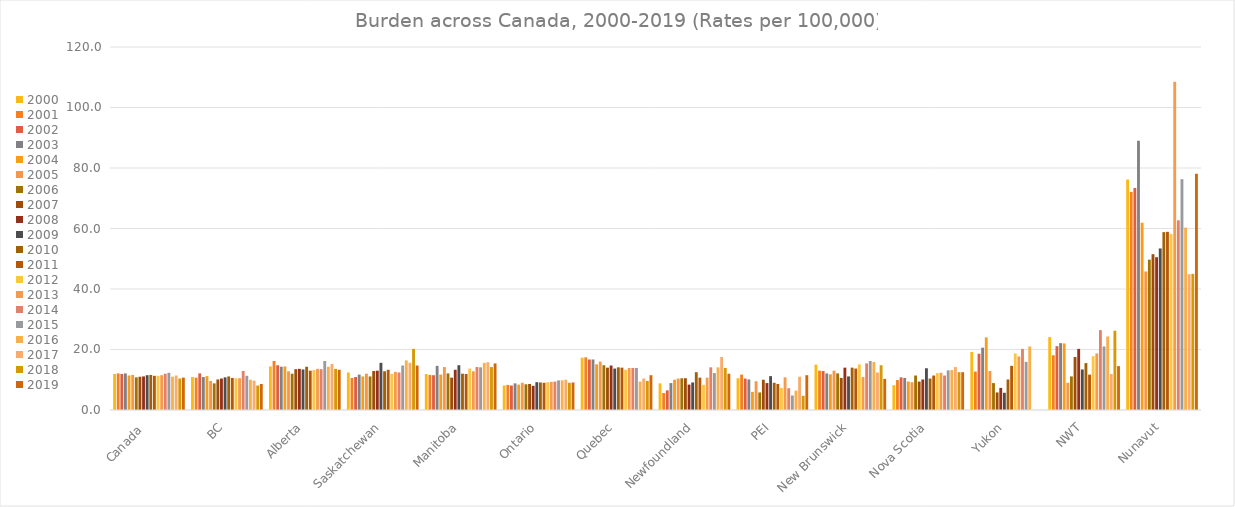
| Category | 2000 | 2001 | 2002 | 2003 | 2004 | 2005 | 2006 | 2007 | 2008 | 2009 | 2010 | 2011 | 2012 | 2013 | 2014 | 2015 | 2016 | 2017 | 2018 | 2019 |
|---|---|---|---|---|---|---|---|---|---|---|---|---|---|---|---|---|---|---|---|---|
| Canada  | 11.9 | 12.1 | 11.9 | 12.1 | 11.4 | 11.6 | 10.8 | 11 | 11.1 | 11.5 | 11.6 | 11.3 | 11.3 | 11.5 | 12 | 12.3 | 11 | 11.4 | 10.4 | 10.7 |
| BC | 10.9 | 10.7 | 12.1 | 10.9 | 11.2 | 9.6 | 8.8 | 10.1 | 10.4 | 10.8 | 11.1 | 10.6 | 10.5 | 10.5 | 12.9 | 11.3 | 10 | 9.7 | 8.1 | 8.6 |
| Alberta | 14.4 | 16.2 | 14.8 | 14.3 | 14.4 | 12.8 | 12 | 13.5 | 13.6 | 13.4 | 14.3 | 13 | 13.2 | 13.6 | 13.5 | 16.2 | 14.3 | 15.2 | 13.6 | 13.3 |
| Saskatchewan | 12.4 | 10.6 | 10.9 | 11.7 | 11.1 | 12 | 11.1 | 12.9 | 13 | 15.6 | 12.8 | 13.3 | 12 | 12.6 | 12.4 | 14.7 | 16.4 | 15.6 | 20.2 | 14.7 |
| Manitoba | 11.9 | 11.6 | 11.5 | 14.6 | 11.7 | 14.2 | 12.1 | 10.7 | 13.3 | 14.8 | 12 | 11.9 | 13.7 | 12.8 | 14.2 | 14.1 | 15.6 | 15.8 | 14.2 | 15.4 |
| Ontario | 8.1 | 8.3 | 8.1 | 8.8 | 8.4 | 9 | 8.5 | 8.6 | 8 | 9.2 | 9.1 | 9 | 9.2 | 9.3 | 9.4 | 9.8 | 9.8 | 10 | 9 | 9.1 |
| Quebec | 17.3 | 17.4 | 16.7 | 16.7 | 15.1 | 16 | 14.8 | 14 | 14.7 | 13.7 | 14.1 | 14 | 13.3 | 13.9 | 13.9 | 13.9 | 9.4 | 10.4 | 9.6 | 11.5 |
| Newfoundland | 8.8 | 5.6 | 6.5 | 8.9 | 10 | 10.4 | 10.5 | 10.5 | 8.4 | 9.1 | 12.5 | 10.7 | 8.3 | 10.7 | 14.1 | 12.2 | 14.1 | 17.5 | 13.9 | 12 |
| PEI | 10.5 | 11.7 | 10.4 | 10.1 | 6 | 9.5 | 5.8 | 10 | 8.9 | 11.2 | 9 | 8.6 | 7.3 | 10.8 | 7.2 | 4.8 | 6.4 | 11 | 4.7 | 11.5 |
| New Brunswick | 15 | 13 | 12.9 | 12.1 | 11.8 | 13 | 12.1 | 10.6 | 14 | 11.1 | 14 | 13.7 | 15.1 | 10.9 | 15.4 | 16.2 | 15.9 | 12.4 | 14.8 | 10.3 |
| Nova Scotia | 8.2 | 9.9 | 10.8 | 10.6 | 9.4 | 9.2 | 11.4 | 9.4 | 10.1 | 13.8 | 10.4 | 11.4 | 12.2 | 12.3 | 11.4 | 13.1 | 13.2 | 14.2 | 12.5 | 12.5 |
| Yukon | 19.2 | 12.7 | 18.6 | 20.6 | 24 | 12.9 | 8.9 | 5.8 | 7.3 | 5.7 | 10.1 | 14.6 | 18.7 | 17.7 | 20.2 | 15.9 | 21 | 0 | 0 | 0 |
| NWT | 24.1 | 18.1 | 21.1 | 22.1 | 22 | 9 | 11.1 | 17.5 | 20.2 | 13.4 | 15.5 | 11.7 | 17.8 | 18.7 | 26.4 | 21 | 24.3 | 11.9 | 26.2 | 14.5 |
| Nunavut | 76.2 | 72.1 | 73.4 | 89 | 61.9 | 45.8 | 49.7 | 51.5 | 50.5 | 53.4 | 58.8 | 58.9 | 58.2 | 108.5 | 62.7 | 76.3 | 60.3 | 44.9 | 45 | 78.1 |